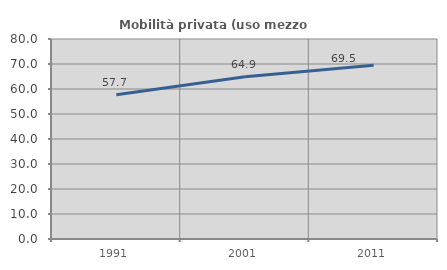
| Category | Mobilità privata (uso mezzo privato) |
|---|---|
| 1991.0 | 57.742 |
| 2001.0 | 64.883 |
| 2011.0 | 69.513 |